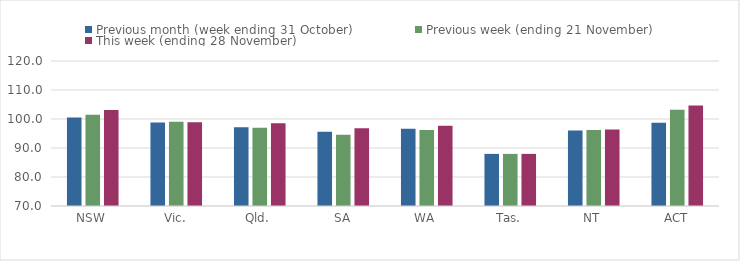
| Category | Previous month (week ending 31 October) | Previous week (ending 21 November) | This week (ending 28 November) |
|---|---|---|---|
| NSW | 100.5 | 101.46 | 103.09 |
| Vic. | 98.83 | 99.03 | 98.88 |
| Qld. | 97.16 | 97 | 98.54 |
| SA | 95.59 | 94.59 | 96.82 |
| WA | 96.67 | 96.19 | 97.67 |
| Tas. | 87.97 | 87.97 | 87.97 |
| NT | 96.05 | 96.18 | 96.34 |
| ACT | 98.71 | 103.23 | 104.63 |